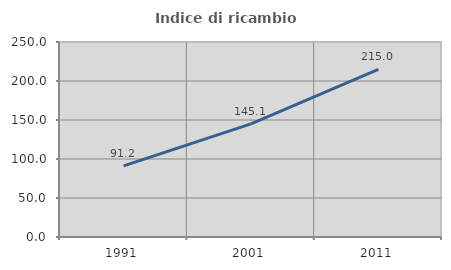
| Category | Indice di ricambio occupazionale  |
|---|---|
| 1991.0 | 91.156 |
| 2001.0 | 145.098 |
| 2011.0 | 215 |